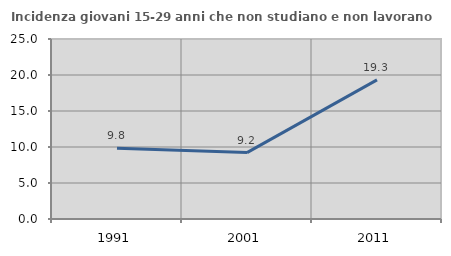
| Category | Incidenza giovani 15-29 anni che non studiano e non lavorano  |
|---|---|
| 1991.0 | 9.834 |
| 2001.0 | 9.22 |
| 2011.0 | 19.328 |